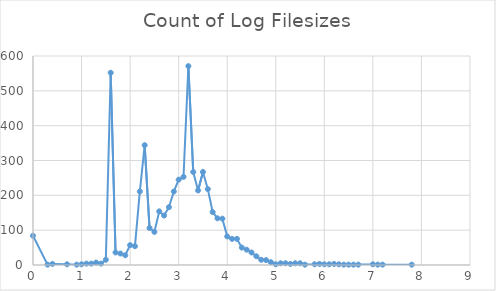
| Category | Count |
|---|---|
| 0.0 | 84 |
| 0.3 | 1 |
| 0.4 | 3 |
| 0.7 | 2 |
| 0.9 | 1 |
| 1.0 | 2 |
| 1.1 | 4 |
| 1.2 | 4 |
| 1.3 | 7 |
| 1.4 | 4 |
| 1.5 | 15 |
| 1.6 | 552 |
| 1.7 | 36 |
| 1.8 | 33 |
| 1.9 | 28 |
| 2.0 | 57 |
| 2.1 | 54 |
| 2.2 | 211 |
| 2.3 | 344 |
| 2.4 | 106 |
| 2.5 | 95 |
| 2.6 | 154 |
| 2.7 | 142 |
| 2.8 | 166 |
| 2.9 | 211 |
| 3.0 | 245 |
| 3.1 | 253 |
| 3.2 | 571 |
| 3.3 | 267 |
| 3.4 | 214 |
| 3.5 | 267 |
| 3.6 | 218 |
| 3.7 | 152 |
| 3.8 | 134 |
| 3.9 | 133 |
| 4.0 | 82 |
| 4.1 | 75 |
| 4.2 | 75 |
| 4.3 | 50 |
| 4.4 | 44 |
| 4.5 | 36 |
| 4.6 | 25 |
| 4.7 | 15 |
| 4.8 | 14 |
| 4.9 | 8 |
| 5.0 | 2 |
| 5.1 | 5 |
| 5.2 | 5 |
| 5.3 | 3 |
| 5.4 | 5 |
| 5.5 | 5 |
| 5.6 | 1 |
| 5.8 | 2 |
| 5.9 | 3 |
| 6.0 | 2 |
| 6.1 | 2 |
| 6.2 | 3 |
| 6.3 | 2 |
| 6.4 | 1 |
| 6.5 | 1 |
| 6.6 | 1 |
| 6.7 | 1 |
| 7.0 | 2 |
| 7.1 | 1 |
| 7.2 | 1 |
| 7.8 | 1 |